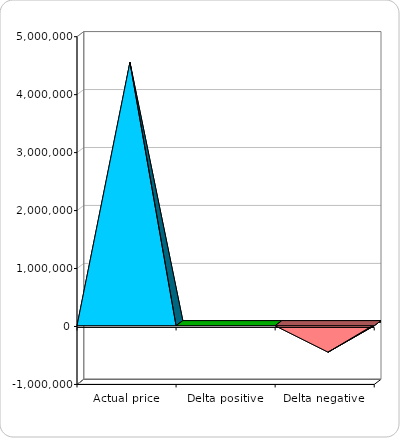
| Category | 0 |
|---|---|
| Actual price | 4500000 |
| Delta positive | 0 |
| Delta negative | -500000 |